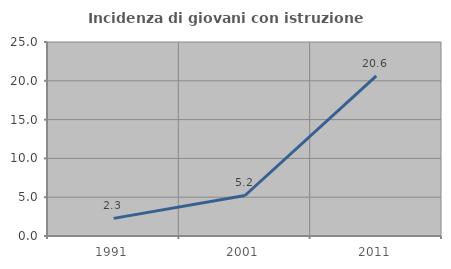
| Category | Incidenza di giovani con istruzione universitaria |
|---|---|
| 1991.0 | 2.273 |
| 2001.0 | 5.221 |
| 2011.0 | 20.645 |